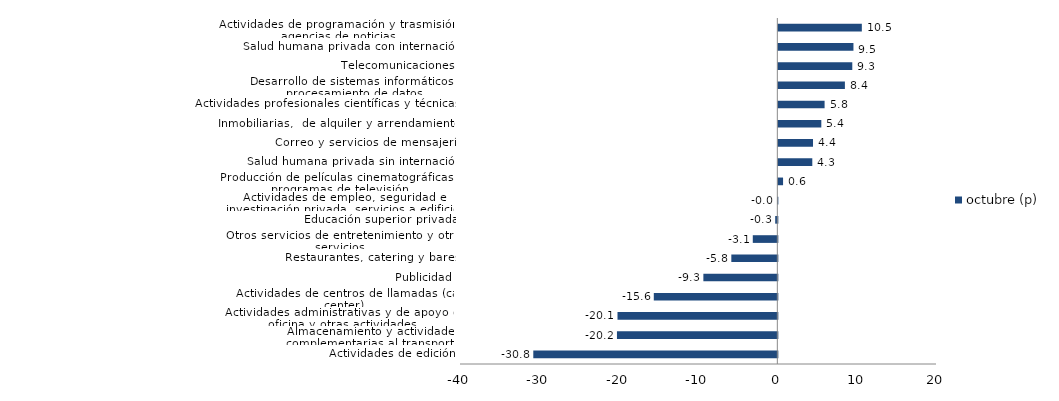
| Category | octubre (p) |
|---|---|
| Actividades de edición | -30.762 |
| Almacenamiento y actividades complementarias al transporte | -20.216 |
| Actividades administrativas y de apoyo de oficina y otras actividades | -20.148 |
| Actividades de centros de llamadas (call center) | -15.571 |
| Publicidad | -9.323 |
| Restaurantes, catering y bares | -5.799 |
| Otros servicios de entretenimiento y otros servicios | -3.094 |
| Educación superior privada | -0.269 |
| Actividades de empleo, seguridad e investigación privada, servicios a edificios | -0.025 |
| Producción de películas cinematográficas y programas de televisión | 0.597 |
| Salud humana privada sin internación | 4.282 |
| Correo y servicios de mensajería | 4.371 |
| Inmobiliarias,  de alquiler y arrendamiento  | 5.418 |
| Actividades profesionales científicas y técnicas  | 5.831 |
| Desarrollo de sistemas informáticos y procesamiento de datos | 8.391 |
| Telecomunicaciones | 9.322 |
| Salud humana privada con internación | 9.469 |
| Actividades de programación y trasmisión,  agencias de noticias | 10.525 |